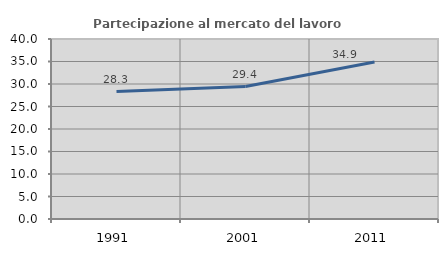
| Category | Partecipazione al mercato del lavoro  femminile |
|---|---|
| 1991.0 | 28.324 |
| 2001.0 | 29.433 |
| 2011.0 | 34.894 |